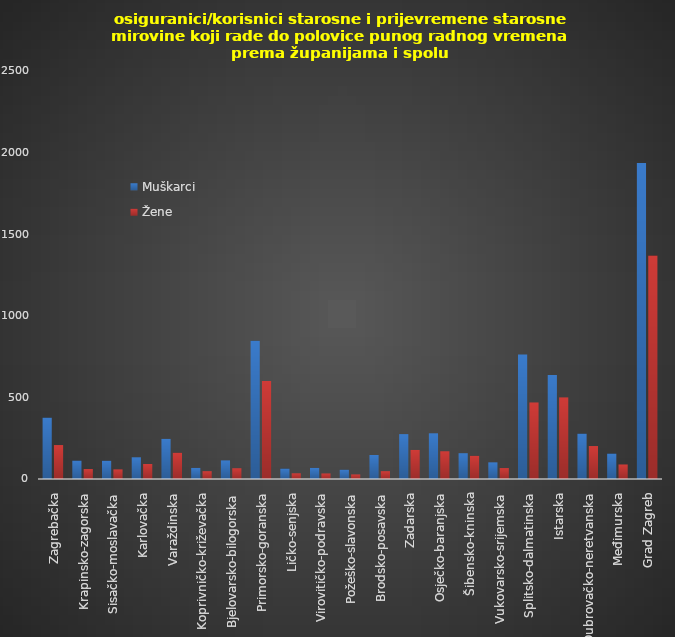
| Category | Muškarci | Žene |
|---|---|---|
| Zagrebačka | 376 | 208 |
| Krapinsko-zagorska | 113 | 61 |
| Sisačko-moslavačka | 112 | 59 |
| Karlovačka | 133 | 92 |
| Varaždinska | 246 | 161 |
| Koprivničko-križevačka | 68 | 48 |
| Bjelovarsko-bilogorska | 114 | 66 |
| Primorsko-goranska | 847 | 601 |
| Ličko-senjska | 64 | 35 |
| Virovitičko-podravska | 68 | 34 |
| Požeško-slavonska | 57 | 28 |
| Brodsko-posavska | 147 | 48 |
| Zadarska | 275 | 178 |
| Osječko-baranjska | 280 | 170 |
| Šibensko-kninska | 158 | 142 |
| Vukovarsko-srijemska | 102 | 67 |
| Splitsko-dalmatinska | 763 | 469 |
| Istarska | 638 | 500 |
| Dubrovačko-neretvanska | 278 | 202 |
| Međimurska | 156 | 89 |
| Grad Zagreb | 1936 | 1369 |